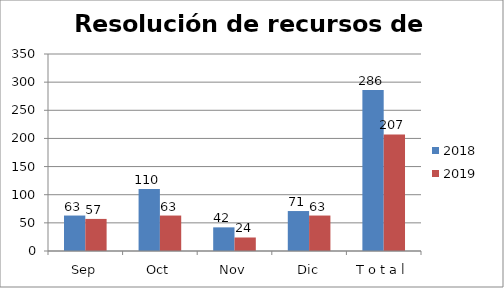
| Category | 2018 | 2019 |
|---|---|---|
| Sep | 63 | 57 |
| Oct | 110 | 63 |
| Nov | 42 | 24 |
| Dic | 71 | 63 |
| T o t a l | 286 | 207 |